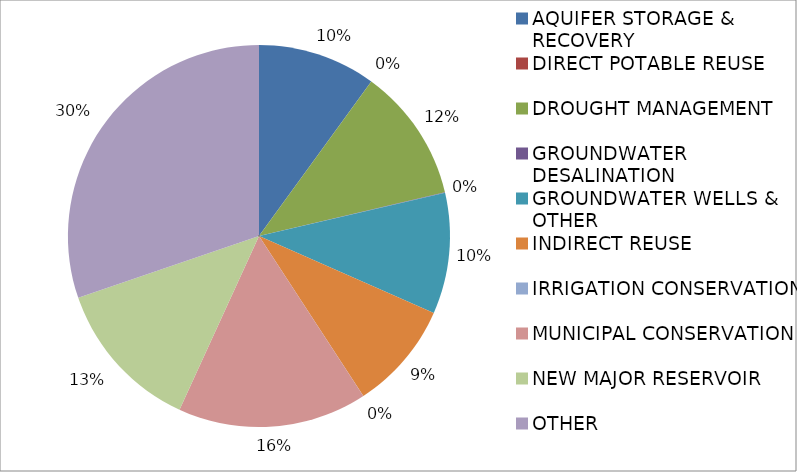
| Category | Series 0 |
|---|---|
| AQUIFER STORAGE & RECOVERY | 282868 |
| DIRECT POTABLE REUSE | 35 |
| DROUGHT MANAGEMENT | 320229 |
| GROUNDWATER DESALINATION | 1332 |
| GROUNDWATER WELLS & OTHER | 289409 |
| INDIRECT REUSE | 259942 |
| IRRIGATION CONSERVATION | 57 |
| MUNICIPAL CONSERVATION | 453345 |
| NEW MAJOR RESERVOIR | 365494 |
| OTHER | 855263 |